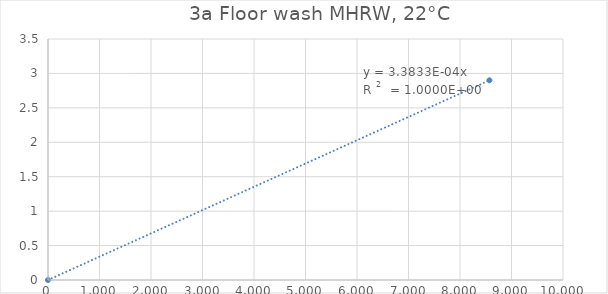
| Category | Series 0 |
|---|---|
| 0.0 | 0 |
| 8571.428571428572 | 2.9 |